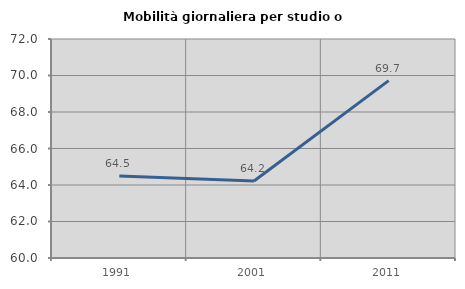
| Category | Mobilità giornaliera per studio o lavoro |
|---|---|
| 1991.0 | 64.493 |
| 2001.0 | 64.216 |
| 2011.0 | 69.721 |